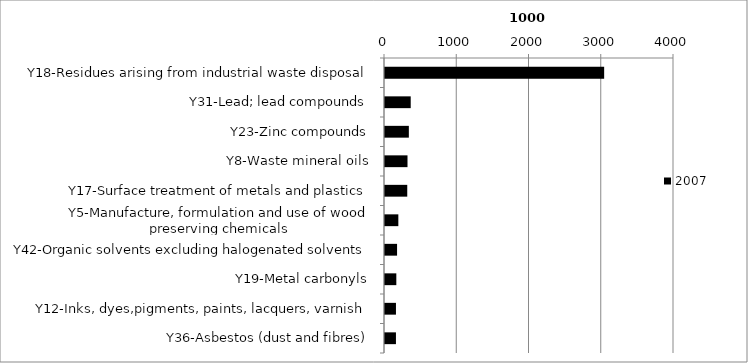
| Category | 2007 |
|---|---|
| Y18-Residues arising from industrial waste disposal | 3033.335 |
| Y31-Lead; lead compounds | 355.858 |
| Y23-Zinc compounds | 330.01 |
| Y8-Waste mineral oils | 311.422 |
| Y17-Surface treatment of metals and plastics | 308.008 |
| Y5-Manufacture, formulation and use of wood preserving chemicals | 184.642 |
| Y42-Organic solvents excluding halogenated solvents | 166.96 |
| Y19-Metal carbonyls | 156.731 |
| Y12-Inks, dyes,pigments, paints, lacquers, varnish | 151.66 |
| Y36-Asbestos (dust and fibres) | 151.513 |